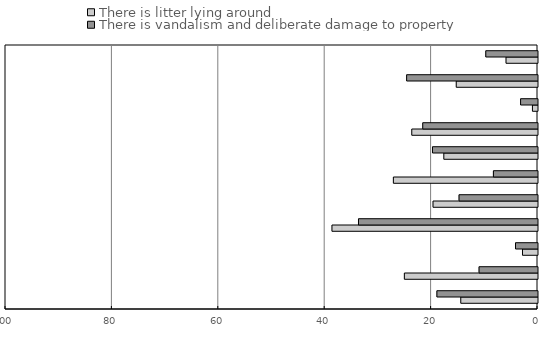
| Category | There is litter lying around | There is vandalism and deliberate damage to property |
|---|---|---|
| 0 | -14.423 | -18.909 |
| 1 | -25.025 | -10.985 |
| 2 | -2.821 | -4.134 |
| 3 | -38.634 | -33.648 |
| 4 | -19.637 | -14.748 |
| 5 | -27.089 | -8.288 |
| 6 | -17.608 | -19.738 |
| 7 | -23.632 | -21.57 |
| 8 | -0.951 | -3.18 |
| 9 | -15.272 | -24.6 |
| 10 | -5.917 | -9.722 |